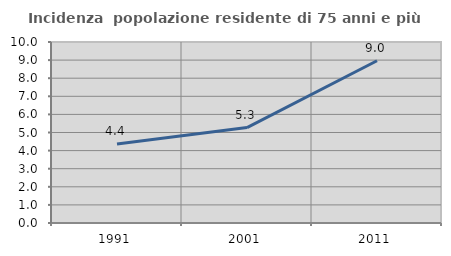
| Category | Incidenza  popolazione residente di 75 anni e più |
|---|---|
| 1991.0 | 4.361 |
| 2001.0 | 5.272 |
| 2011.0 | 8.965 |